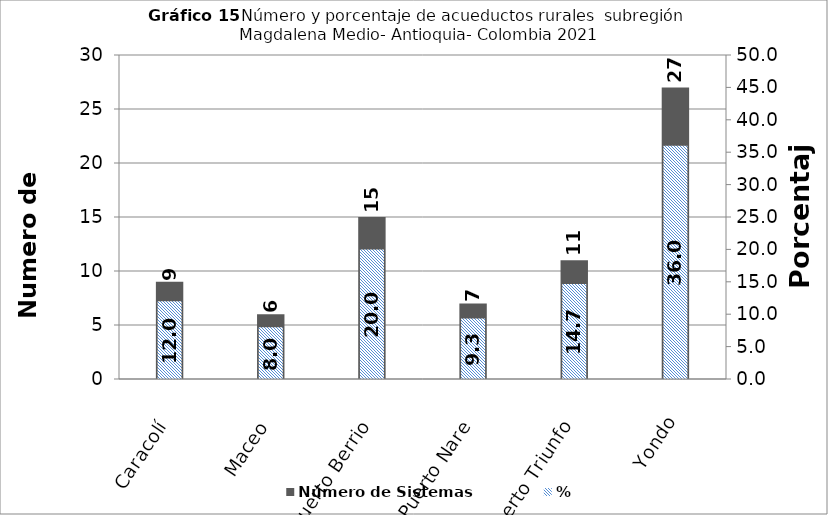
| Category | Número de Sistemas |
|---|---|
| Caracolí | 9 |
| Maceo | 6 |
| Puerto Berrio | 15 |
| Puerto Nare | 7 |
| Puerto Triunfo | 11 |
| Yondo | 27 |